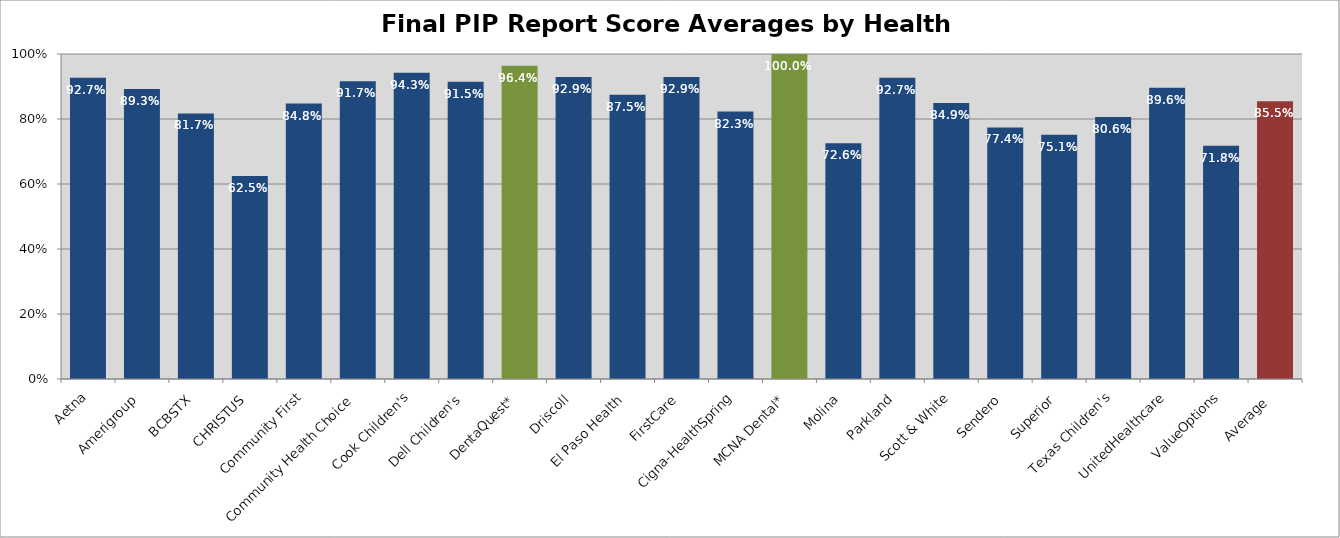
| Category | Final PIP Report
Averages |
|---|---|
| Aetna | 0.927 |
| Amerigroup | 0.893 |
| BCBSTX | 0.817 |
| CHRISTUS | 0.625 |
| Community First | 0.848 |
| Community Health Choice | 0.916 |
| Cook Children's | 0.942 |
| Dell Children's | 0.915 |
| DentaQuest* | 0.964 |
| Driscoll | 0.929 |
| El Paso Health | 0.875 |
| FirstCare | 0.929 |
| Cigna-HealthSpring | 0.823 |
| MCNA Dental* | 1 |
| Molina | 0.726 |
| Parkland | 0.927 |
| Scott & White | 0.849 |
| Sendero | 0.774 |
| Superior | 0.751 |
| Texas Children's | 0.806 |
| UnitedHealthcare | 0.896 |
| ValueOptions | 0.718 |
| Average  | 0.855 |